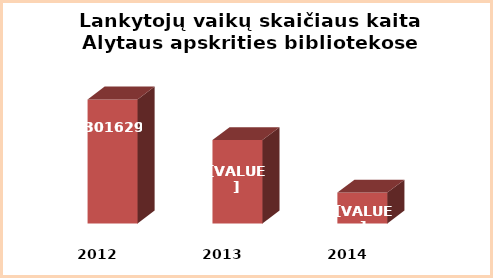
| Category | Series 0 |
|---|---|
| 2012.0 | 301629 |
| 2013.0 | 296832 |
| 2014.0 | 290645 |